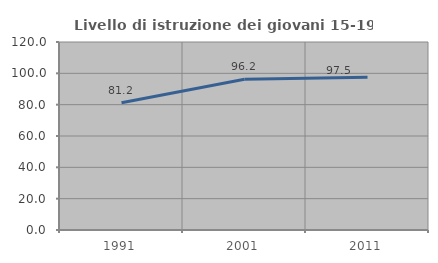
| Category | Livello di istruzione dei giovani 15-19 anni |
|---|---|
| 1991.0 | 81.186 |
| 2001.0 | 96.163 |
| 2011.0 | 97.507 |